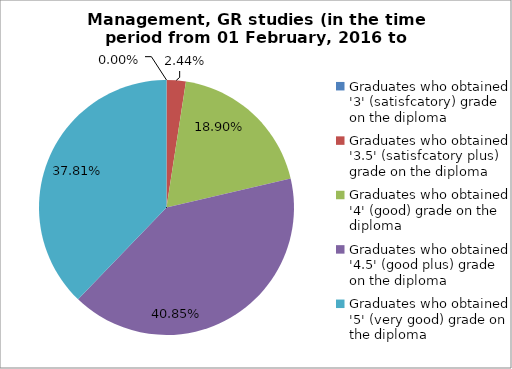
| Category | Series 0 |
|---|---|
| Graduates who obtained '3' (satisfcatory) grade on the diploma | 0 |
| Graduates who obtained '3.5' (satisfcatory plus) grade on the diploma | 2.439 |
| Graduates who obtained '4' (good) grade on the diploma | 18.902 |
| Graduates who obtained '4.5' (good plus) grade on the diploma | 40.854 |
| Graduates who obtained '5' (very good) grade on the diploma | 37.805 |